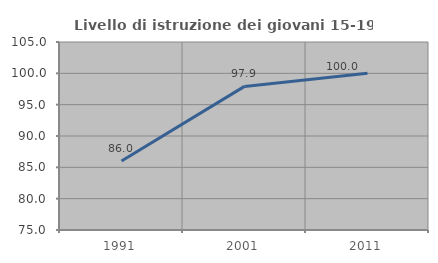
| Category | Livello di istruzione dei giovani 15-19 anni |
|---|---|
| 1991.0 | 86.022 |
| 2001.0 | 97.917 |
| 2011.0 | 100 |